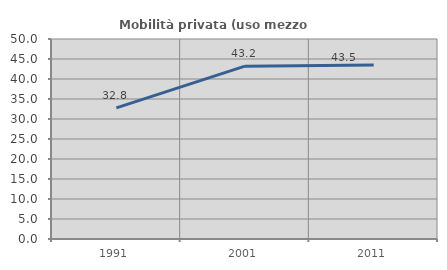
| Category | Mobilità privata (uso mezzo privato) |
|---|---|
| 1991.0 | 32.763 |
| 2001.0 | 43.212 |
| 2011.0 | 43.501 |